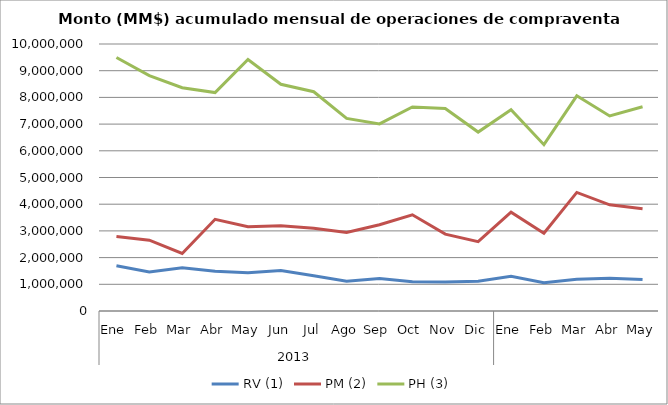
| Category | RV (1) | PM (2) | PH (3) |
|---|---|---|---|
| 0 | 1693090.019 | 2788692.01 | 9495719.157 |
| 1 | 1457870.523 | 2652319.476 | 8814454.346 |
| 2 | 1619570.46 | 2155113.626 | 8361658.957 |
| 3 | 1485677.791 | 3434435.881 | 8182321.991 |
| 4 | 1434943.507 | 3155786.06 | 9417818.094 |
| 5 | 1516566.545 | 3191285.457 | 8490151.421 |
| 6 | 1322115.523 | 3099755.507 | 8212010.547 |
| 7 | 1118245.895 | 2937089.197 | 7211658.784 |
| 8 | 1215047.725 | 3232334.418 | 7008526.172 |
| 9 | 1092035.083 | 3603082.09 | 7640993.748 |
| 10 | 1088055.605 | 2879188.198 | 7583918.365 |
| 11 | 1114851.326 | 2596986.123 | 6700659.979 |
| 12 | 1296256.43 | 3700290.091 | 7538361.261 |
| 13 | 1061199.219 | 2915830.381 | 6230064.605 |
| 14 | 1189463.212 | 4440910.02 | 8058380.739 |
| 15 | 1231035.305 | 3977428.452 | 7305106.144 |
| 16 | 1178985.046 | 3830415.456 | 7649023.753 |